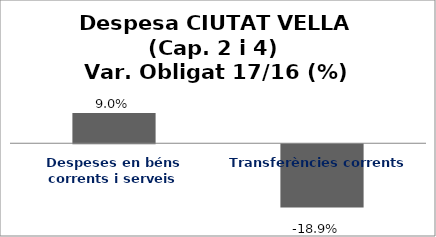
| Category | Series 0 |
|---|---|
| Despeses en béns corrents i serveis | 0.09 |
| Transferències corrents | -0.189 |